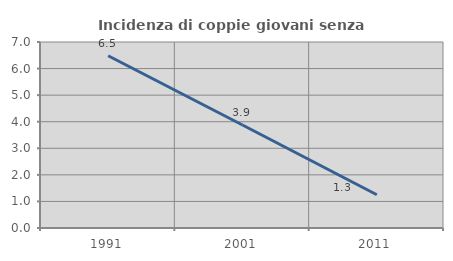
| Category | Incidenza di coppie giovani senza figli |
|---|---|
| 1991.0 | 6.481 |
| 2001.0 | 3.876 |
| 2011.0 | 1.25 |